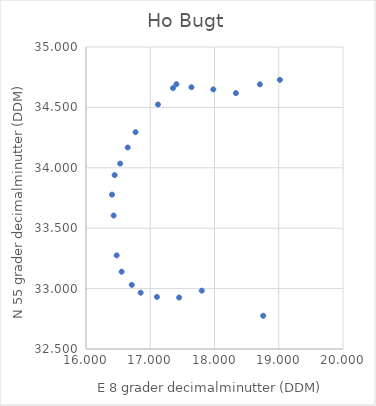
| Category | Series 0 |
|---|---|
| 19.018 | 34.728 |
| 18.706 | 34.691 |
| 18.333 | 34.618 |
| 17.981 | 34.649 |
| 17.641 | 34.667 |
| 17.407 | 34.692 |
| 17.354 | 34.66 |
| 17.12 | 34.524 |
| 16.771 | 34.295 |
| 16.649 | 34.168 |
| 16.532 | 34.035 |
| 16.446 | 33.94 |
| 16.405 | 33.778 |
| 16.43 | 33.605 |
| 16.477 | 33.275 |
| 16.555 | 33.14 |
| 16.713 | 33.031 |
| 16.851 | 32.966 |
| 17.104 | 32.931 |
| 17.45 | 32.926 |
| 17.802 | 32.983 |
| 18.758 | 32.775 |